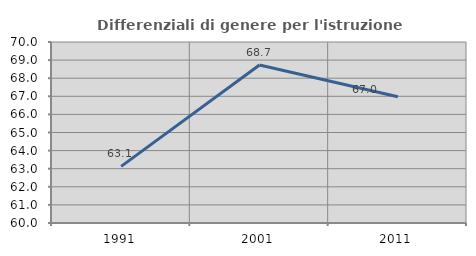
| Category | Differenziali di genere per l'istruzione superiore |
|---|---|
| 1991.0 | 63.129 |
| 2001.0 | 68.732 |
| 2011.0 | 66.973 |